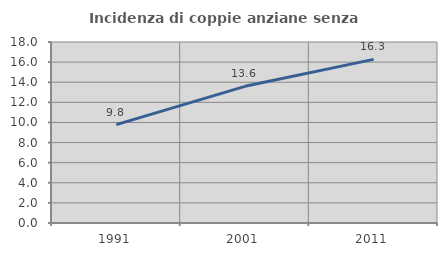
| Category | Incidenza di coppie anziane senza figli  |
|---|---|
| 1991.0 | 9.779 |
| 2001.0 | 13.592 |
| 2011.0 | 16.272 |